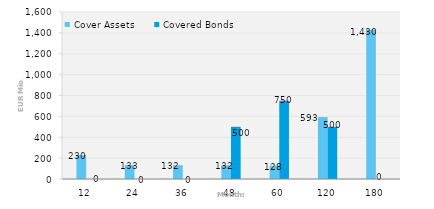
| Category | Cover Assets | Covered Bonds |
|---|---|---|
| 12.0 | 230.028 | 0 |
| 24.0 | 132.65 | 0 |
| 36.0 | 132.248 | 0 |
| 48.0 | 132.057 | 500 |
| 60.0 | 127.834 | 750 |
| 120.0 | 593.11 | 500 |
| 180.0 | 1429.843 | 0 |